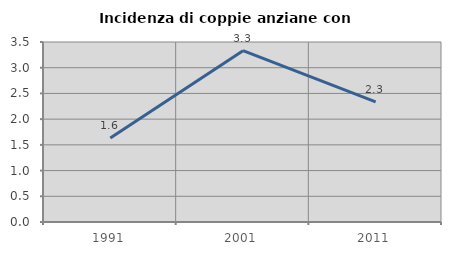
| Category | Incidenza di coppie anziane con figli |
|---|---|
| 1991.0 | 1.631 |
| 2001.0 | 3.331 |
| 2011.0 | 2.337 |